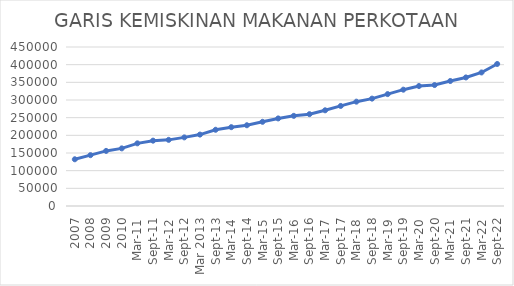
| Category | GARIS KEMISKINAN MAKANAN PERKOTAAN |
|---|---|
| 2007 | 132259 |
| 2008 | 143897 |
| 2009 | 155909 |
| 2010 | 163077 |
| Mar-11 | 177342 |
| Sep-11 | 184919 |
| Mar-12 | 187194 |
| Sep-12 | 194207 |
| Mar 2013 | 202137 |
| Sep-13 | 215750 |
| Mar-14 | 223091 |
| Sep-14 | 228534 |
| Mar-15 | 238278 |
| Sep-15 | 247840 |
| Mar-16 | 255181 |
| Sep-16 | 259886 |
| Mar-17 | 270856.32 |
| Sep-17 | 283220 |
| Mar-18 | 295272 |
| Sep-18 | 303909.85 |
| Mar-19 | 316687 |
| Sep-19 | 329220 |
| Mar-20 | 339519 |
| Sep-20 | 342356 |
| Mar-21 | 353767 |
| Sep-21 | 363836 |
| Mar-22 | 377958 |
| Sep-22 | 401969 |